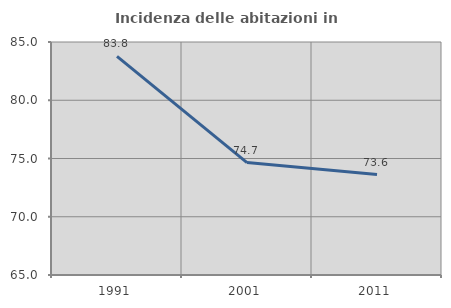
| Category | Incidenza delle abitazioni in proprietà  |
|---|---|
| 1991.0 | 83.763 |
| 2001.0 | 74.653 |
| 2011.0 | 73.624 |